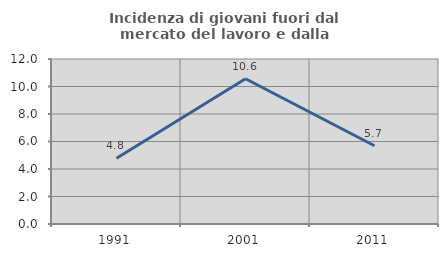
| Category | Incidenza di giovani fuori dal mercato del lavoro e dalla formazione  |
|---|---|
| 1991.0 | 4.787 |
| 2001.0 | 10.563 |
| 2011.0 | 5.691 |